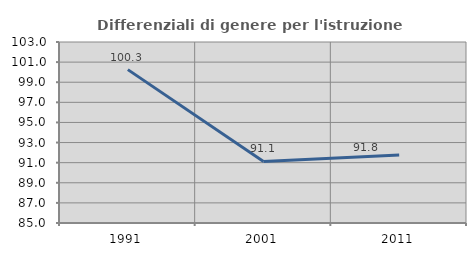
| Category | Differenziali di genere per l'istruzione superiore |
|---|---|
| 1991.0 | 100.253 |
| 2001.0 | 91.12 |
| 2011.0 | 91.77 |